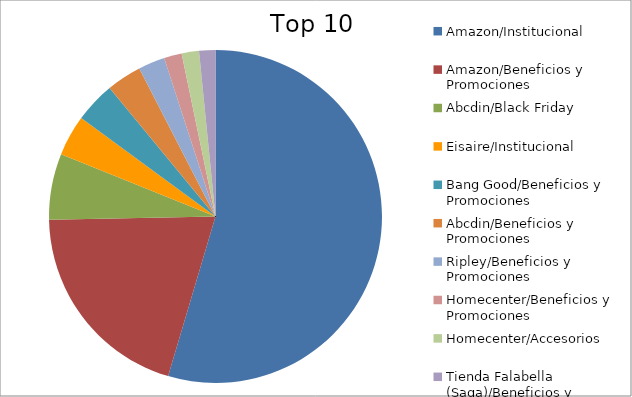
| Category | Series 0 |
|---|---|
| Amazon/Institucional | 49.35 |
| Amazon/Beneficios y Promociones | 18.16 |
| Abcdin/Black Friday | 5.81 |
| Eisaire/Institucional | 3.58 |
| Bang Good/Beneficios y Promociones | 3.58 |
| Abcdin/Beneficios y Promociones | 3.08 |
| Ripley/Beneficios y Promociones | 2.33 |
| Homecenter/Beneficios y Promociones | 1.56 |
| Homecenter/Accesorios | 1.52 |
| Tienda Falabella (Saga)/Beneficios y Promociones | 1.43 |